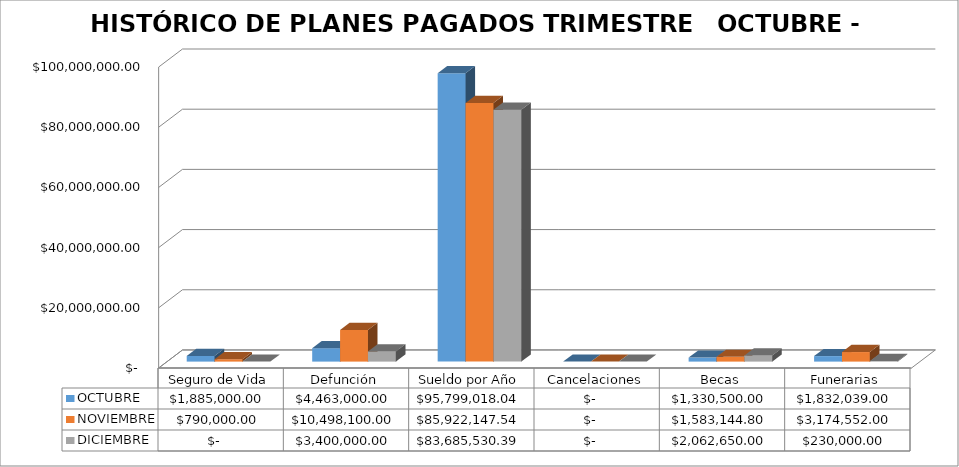
| Category | OCTUBRE | NOVIEMBRE | DICIEMBRE |
|---|---|---|---|
| Seguro de Vida | 1885000 | 790000 | 0 |
| Defunción | 4463000 | 10498100 | 3400000 |
| Sueldo por Año | 95799018.04 | 85922147.54 | 83685530.39 |
| Cancelaciones | 0 | 0 | 0 |
| Becas | 1330500 | 1583144.8 | 2062650 |
| Funerarias | 1832039 | 3174552 | 230000 |